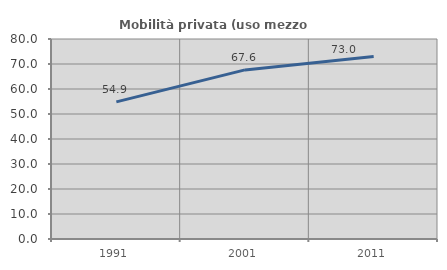
| Category | Mobilità privata (uso mezzo privato) |
|---|---|
| 1991.0 | 54.865 |
| 2001.0 | 67.641 |
| 2011.0 | 72.993 |